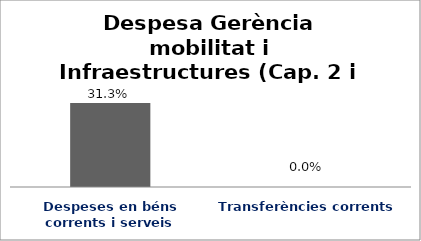
| Category | Series 0 |
|---|---|
| Despeses en béns corrents i serveis | 0.313 |
| Transferències corrents | 0 |